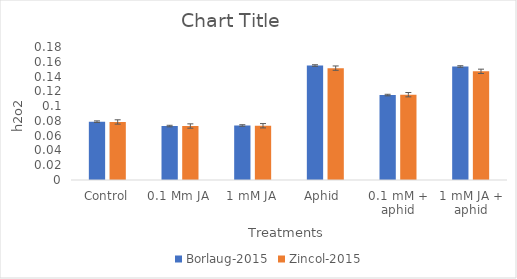
| Category | Borlaug-2015 | Zincol-2015 |
|---|---|---|
| Control | 0.079 | 0.079 |
| 0.1 Mm JA | 0.073 | 0.073 |
| 1 mM JA | 0.074 | 0.073 |
| Aphid  | 0.155 | 0.151 |
| 0.1 mM + aphid | 0.115 | 0.115 |
| 1 mM JA + aphid | 0.154 | 0.147 |